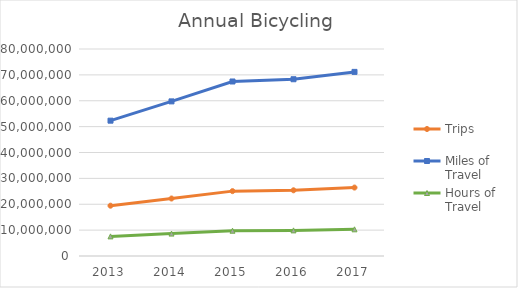
| Category | Trips | Miles of Travel | Hours of Travel |
|---|---|---|---|
| 2013 | 19444155.285 | 52305555.482 | 7579908.573 |
| 2014 | 22213805.083 | 59756024.226 | 8659600.231 |
| 2015 | 25071677.909 | 67443816.441 | 9773683.842 |
| 2016 | 25393416.106 | 68309305.062 | 9899106.936 |
| 2017 | 26450975.911 | 71154183.239 | 10311375.122 |